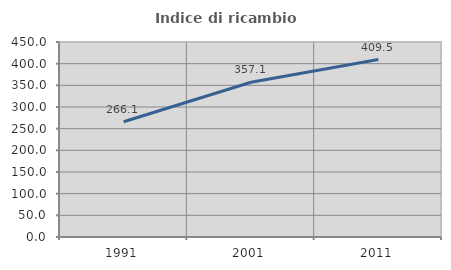
| Category | Indice di ricambio occupazionale  |
|---|---|
| 1991.0 | 266.071 |
| 2001.0 | 357.143 |
| 2011.0 | 409.524 |